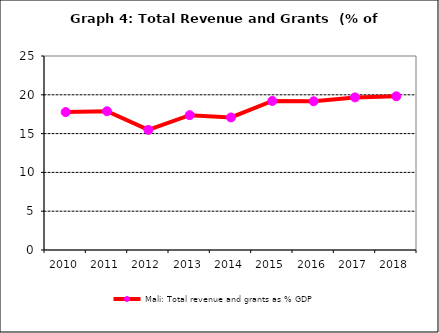
| Category | Mali: Total revenue and grants as % GDP |
|---|---|
| 2010.0 | 17.773 |
| 2011.0 | 17.881 |
| 2012.0 | 15.479 |
| 2013.0 | 17.378 |
| 2014.0 | 17.08 |
| 2015.0 | 19.207 |
| 2016.0 | 19.166 |
| 2017.0 | 19.666 |
| 2018.0 | 19.808 |